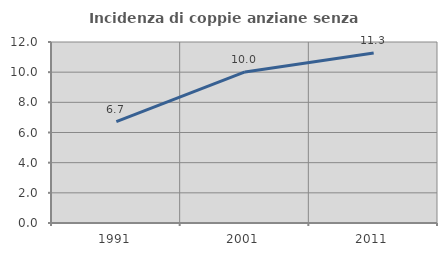
| Category | Incidenza di coppie anziane senza figli  |
|---|---|
| 1991.0 | 6.724 |
| 2001.0 | 10.014 |
| 2011.0 | 11.275 |